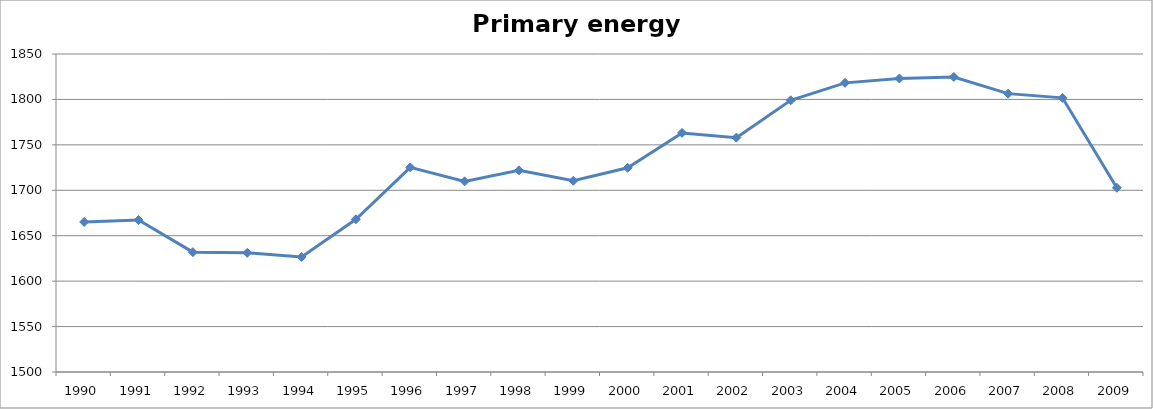
| Category | Total (as reported) |
|---|---|
| 1990.0 | 1665.14 |
| 1991.0 | 1667.257 |
| 1992.0 | 1631.908 |
| 1993.0 | 1631.156 |
| 1994.0 | 1626.537 |
| 1995.0 | 1668.07 |
| 1996.0 | 1725.213 |
| 1997.0 | 1709.819 |
| 1998.0 | 1721.967 |
| 1999.0 | 1710.515 |
| 2000.0 | 1724.741 |
| 2001.0 | 1763.145 |
| 2002.0 | 1757.959 |
| 2003.0 | 1799.057 |
| 2004.0 | 1818.24 |
| 2005.0 | 1823.078 |
| 2006.0 | 1824.706 |
| 2007.0 | 1806.378 |
| 2008.0 | 1801.75 |
| 2009.0 | 1702.755 |